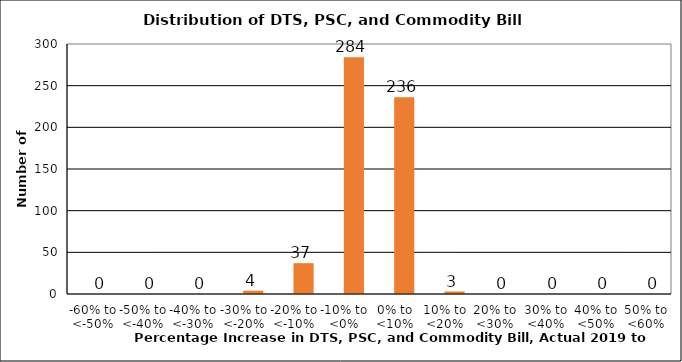
| Category | Series 0 | Series 1 |
|---|---|---|
| -60% to <-50% |  | 0 |
| -50% to <-40% |  | 0 |
| -40% to <-30% |  | 0 |
| -30% to <-20% |  | 4 |
| -20% to <-10% |  | 37 |
| -10% to <0% |  | 284 |
| 0% to <10% |  | 236 |
| 10% to <20% |  | 3 |
| 20% to <30% |  | 0 |
| 30% to <40% |  | 0 |
| 40% to <50% |  | 0 |
| 50% to <60% |  | 0 |